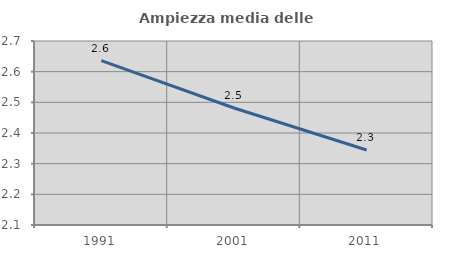
| Category | Ampiezza media delle famiglie |
|---|---|
| 1991.0 | 2.636 |
| 2001.0 | 2.482 |
| 2011.0 | 2.344 |